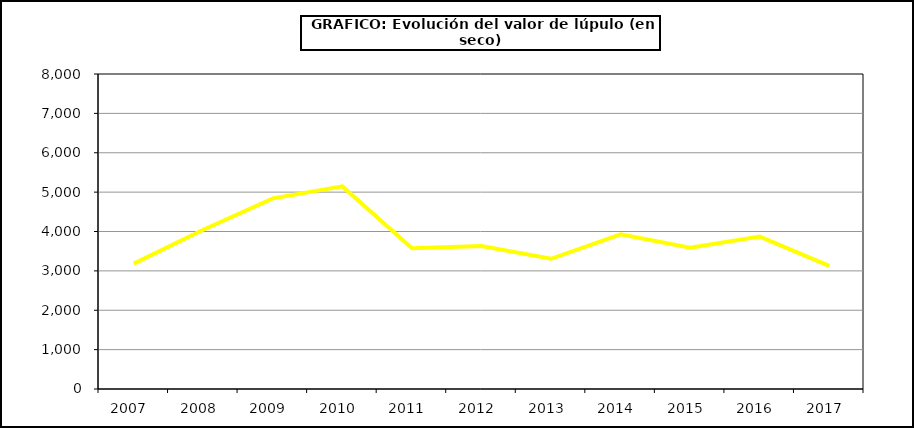
| Category | Valor |
|---|---|
| 2007.0 | 3185.28 |
| 2008.0 | 4045.86 |
| 2009.0 | 4841.88 |
| 2010.0 | 5145.68 |
| 2011.0 | 3575.44 |
| 2012.0 | 3629.5 |
| 2013.0 | 3307.08 |
| 2014.0 | 3927.8 |
| 2015.0 | 3588 |
| 2016.0 | 3870 |
| 2017.0 | 3128.4 |